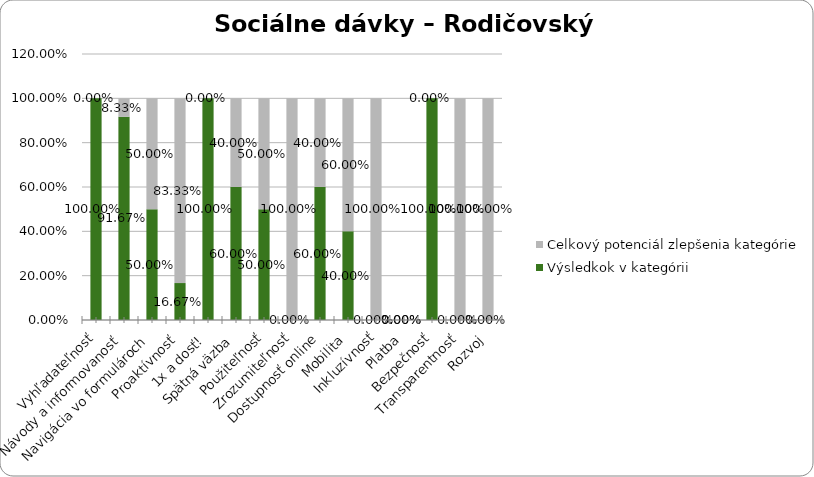
| Category | Výsledkok v kategórii | Celkový potenciál zlepšenia kategórie |
|---|---|---|
| Vyhľadateľnosť | 1 | 0 |
| Návody a informovanosť | 0.917 | 0.083 |
| Navigácia vo formulároch | 0.5 | 0.5 |
| Proaktívnosť | 0.167 | 0.833 |
| 1x a dosť! | 1 | 0 |
| Spätná väzba | 0.6 | 0.4 |
| Použiteľnosť | 0.5 | 0.5 |
| Zrozumiteľnosť | 0 | 1 |
| Dostupnosť online | 0.6 | 0.4 |
| Mobilita | 0.4 | 0.6 |
| Inkluzívnosť | 0 | 1 |
| Platba | 0 | 0 |
| Bezpečnosť | 1 | 0 |
| Transparentnosť | 0 | 1 |
| Rozvoj | 0 | 1 |